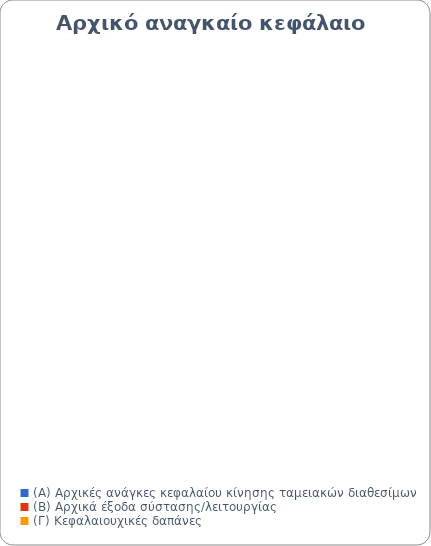
| Category | Series 0 |
|---|---|
| (Α) Αρχικές ανάγκες κεφαλαίου κίνησης ταμειακών διαθεσίμων | 0 |
| (Β) Αρχικά έξοδα σύστασης/λειτουργίας | 0 |
| (Γ) Κεφαλαιουχικές δαπάνες | 0 |